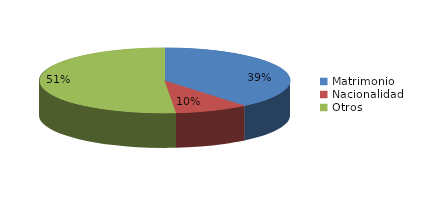
| Category | Series 0 |
|---|---|
| Matrimonio | 3990 |
| Nacionalidad | 972 |
| Otros | 5258 |